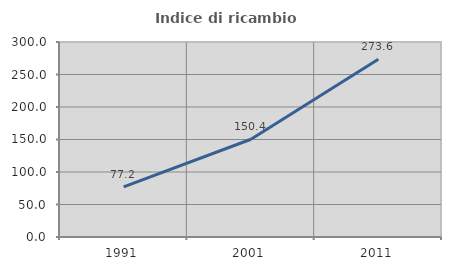
| Category | Indice di ricambio occupazionale  |
|---|---|
| 1991.0 | 77.164 |
| 2001.0 | 150.386 |
| 2011.0 | 273.616 |